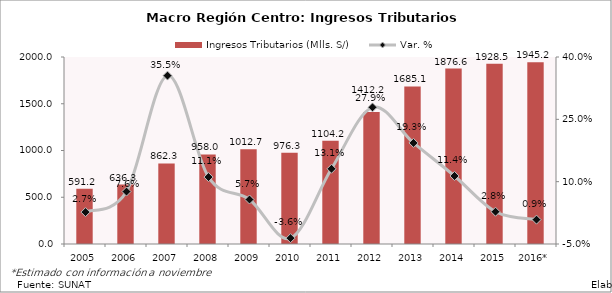
| Category | Ingresos Tributarios (Mlls. S/) |
|---|---|
| 2005 | 591.227 |
| 2006 | 636.277 |
| 2007 | 862.274 |
| 2008 | 958.047 |
| 2009 | 1012.711 |
| 2010 | 976.348 |
| 2011 | 1104.239 |
| 2012 | 1412.204 |
| 2013 | 1685.069 |
| 2014 | 1876.634 |
| 2015 | 1928.496 |
| 2016* | 1945.18 |